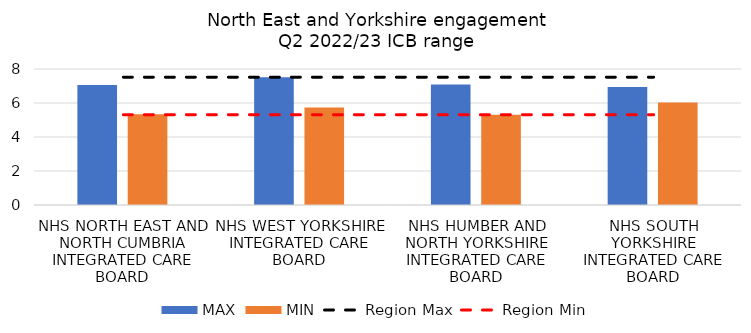
| Category | MAX | MIN |
|---|---|---|
| NHS NORTH EAST AND NORTH CUMBRIA INTEGRATED CARE BOARD | 7.06 | 5.342 |
| NHS WEST YORKSHIRE INTEGRATED CARE BOARD | 7.518 | 5.737 |
| NHS HUMBER AND NORTH YORKSHIRE INTEGRATED CARE BOARD | 7.084 | 5.315 |
| NHS SOUTH YORKSHIRE INTEGRATED CARE BOARD | 6.944 | 6.031 |